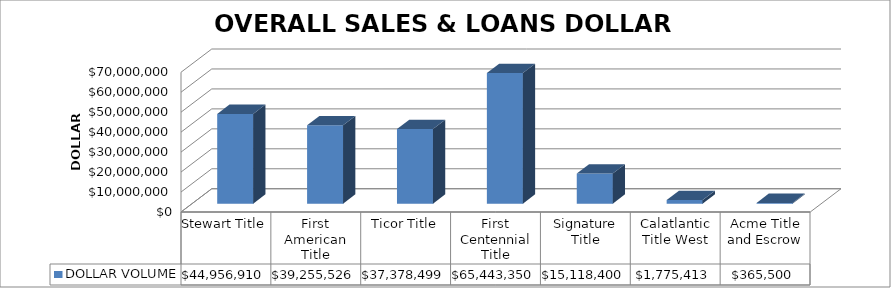
| Category | DOLLAR VOLUME |
|---|---|
| Stewart Title | 44956910 |
| First American Title | 39255525.52 |
| Ticor Title | 37378499.05 |
| First Centennial Title | 65443350 |
| Signature Title | 15118400 |
| Calatlantic Title West | 1775413 |
| Acme Title and Escrow | 365500 |